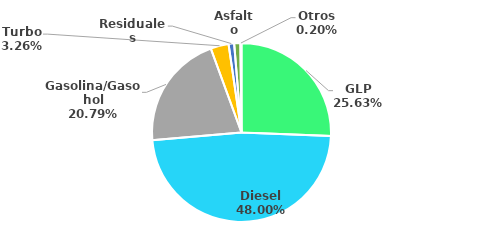
| Category | MBPD |
|---|---|
| GLP | 60.76 |
| Diesel | 113.765 |
| Gasolina/Gasohol | 49.278 |
| Turbo | 7.726 |
| Residuales | 2.389 |
| Asfalto | 2.641 |
| Otros | 0.466 |